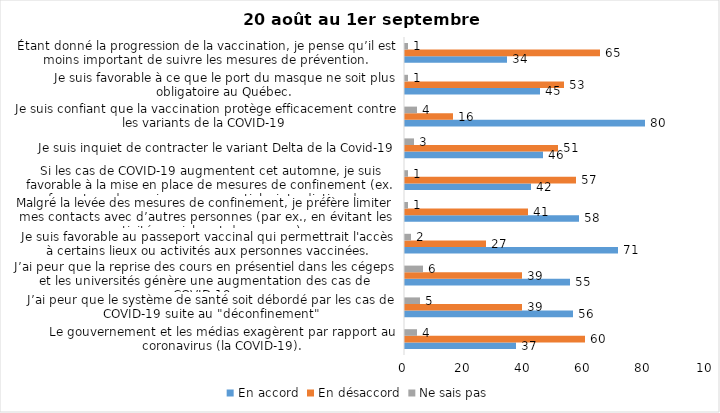
| Category | En accord | En désaccord | Ne sais pas |
|---|---|---|---|
| Le gouvernement et les médias exagèrent par rapport au coronavirus (la COVID-19). | 37 | 60 | 4 |
| J’ai peur que le système de santé soit débordé par les cas de COVID-19 suite au "déconfinement" | 56 | 39 | 5 |
| J’ai peur que la reprise des cours en présentiel dans les cégeps et les universités génère une augmentation des cas de COVID-19. | 55 | 39 | 6 |
| Je suis favorable au passeport vaccinal qui permettrait l'accès à certains lieux ou activités aux personnes vaccinées. | 71 | 27 | 2 |
| Malgré la levée des mesures de confinement, je préfère limiter mes contacts avec d’autres personnes (par ex., en évitant les activités sociales et de groupes) | 58 | 41 | 1 |
| Si les cas de COVID-19 augmentent cet automne, je suis favorable à la mise en place de mesures de confinement (ex. fermeture de services non essentiels, interdiction des rassemblements privés) | 42 | 57 | 1 |
| Je suis inquiet de contracter le variant Delta de la Covid-19 | 46 | 51 | 3 |
| Je suis confiant que la vaccination protège efficacement contre les variants de la COVID-19 | 80 | 16 | 4 |
| Je suis favorable à ce que le port du masque ne soit plus obligatoire au Québec. | 45 | 53 | 1 |
| Étant donné la progression de la vaccination, je pense qu’il est moins important de suivre les mesures de prévention. | 34 | 65 | 1 |